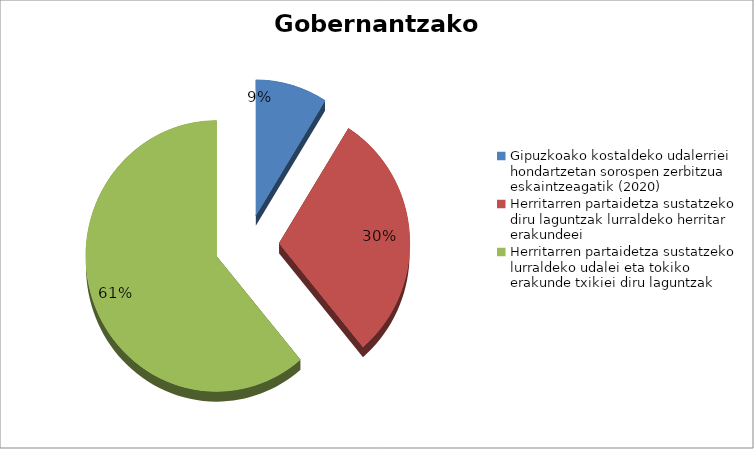
| Category |   Eskaerak | Ezetsiak | Emakida |
|---|---|---|---|
| Gipuzkoako kostaldeko udalerriei hondartzetan sorospen zerbitzua eskaintzeagatik (2020) | 8 | 0 | 117000 |
| Herritarren partaidetza sustatzeko diru laguntzak lurraldeko herritar erakundeei | 27 | 1 | 188592 |
| Herritarren partaidetza sustatzeko lurraldeko udalei eta tokiko erakunde txikiei diru laguntzak | 55 | 13 | 303738.98 |